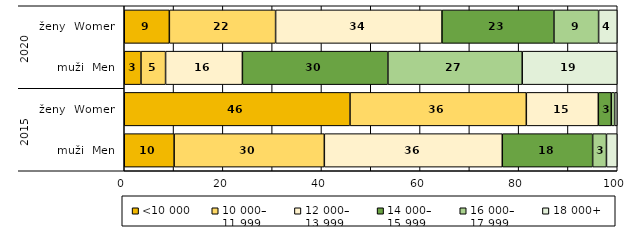
| Category | <10 000 | 10 000–
11 999 | 12 000–
13 999 | 14 000–
15 999 | 16 000–
17 999 | 18 000+ |
|---|---|---|---|---|---|---|
| 0 | 10.117 | 30.467 | 36.099 | 18.326 | 2.804 | 2.187 |
| 1 | 45.792 | 35.765 | 14.607 | 2.627 | 0.688 | 0.523 |
| 2 | 3.389 | 4.993 | 15.584 | 29.512 | 27.244 | 19.277 |
| 3 | 9.148 | 21.553 | 33.75 | 22.704 | 9.063 | 3.782 |